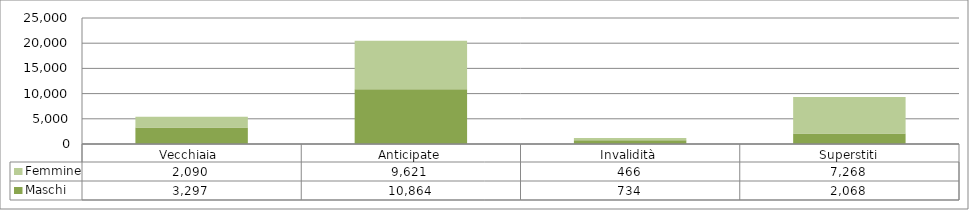
| Category | Maschi | Femmine |
|---|---|---|
| Vecchiaia  | 3297 | 2090 |
| Anticipate | 10864 | 9621 |
| Invalidità | 734 | 466 |
| Superstiti | 2068 | 7268 |